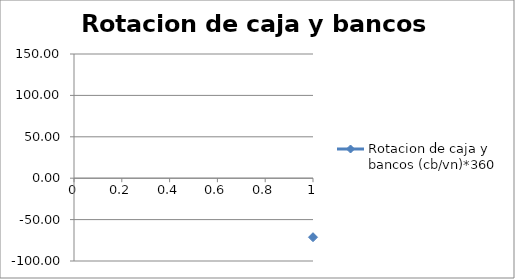
| Category | Rotacion de caja y bancos (cb/vn)*360 |
|---|---|
| 0 | -71.266 |
| 1 | 68.822 |
| 2 | 81.134 |
| 3 | 71.522 |
| 4 | 49.539 |
| 5 | 108.24 |
| 6 | 105.122 |
| 7 | 7.21 |